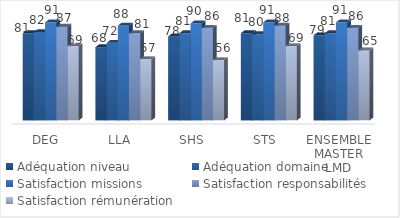
| Category | Adéquation niveau | Adéquation domaine | Satisfaction missions | Satisfaction responsabilités | Satisfaction rémunération |
|---|---|---|---|---|---|
| DEG | 81 | 82 | 91 | 87 | 69 |
| LLA | 68 | 72 | 88 | 81 | 57 |
| SHS | 78 | 81 | 90 | 86 | 56 |
| STS | 81 | 80 | 91 | 88 | 69 |
| ENSEMBLE MASTER LMD | 79 | 81 | 91 | 86 | 65 |